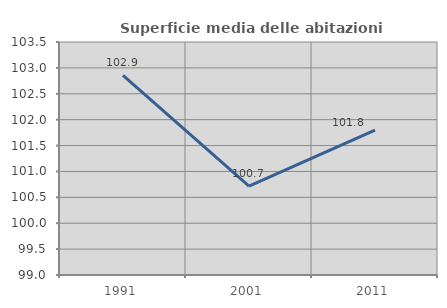
| Category | Superficie media delle abitazioni occupate |
|---|---|
| 1991.0 | 102.856 |
| 2001.0 | 100.716 |
| 2011.0 | 101.796 |